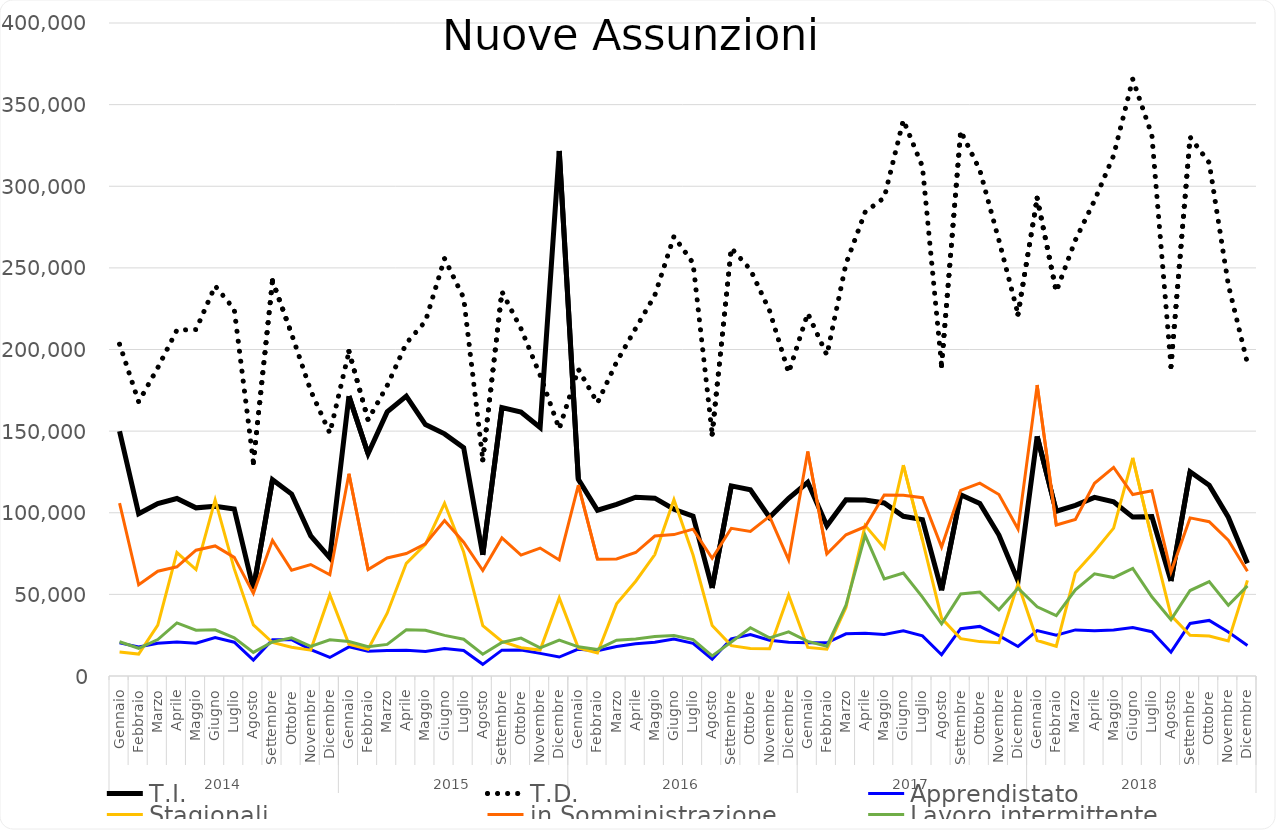
| Category | T.I. | T.D. | Apprendistato | Stagionali | in Somministrazione | Lavoro intermittente |
|---|---|---|---|---|---|---|
| 0 | 149951 | 203248 | 20280 | 14705 | 105866 | 20990 |
| 1 | 99368 | 167928 | 17721 | 13434 | 55878 | 16977 |
| 2 | 105671 | 188845 | 20009 | 31193 | 64186 | 22298 |
| 3 | 108723 | 211908 | 20876 | 75634 | 66905 | 32515 |
| 4 | 103010 | 212198 | 20048 | 65170 | 77067 | 28086 |
| 5 | 103916 | 238981 | 23514 | 107890 | 79683 | 28261 |
| 6 | 102353 | 224605 | 20682 | 65600 | 72672 | 23324 |
| 7 | 53286 | 130707 | 9744 | 31300 | 50602 | 14464 |
| 8 | 120205 | 242121 | 22153 | 20515 | 83093 | 20807 |
| 9 | 111455 | 209450 | 22258 | 17567 | 64760 | 23389 |
| 10 | 85823 | 174766 | 16131 | 15859 | 68301 | 18116 |
| 11 | 72408 | 148754 | 11359 | 49805 | 62007 | 22158 |
| 12 | 171431 | 198775 | 17845 | 19476 | 123860 | 21126 |
| 13 | 136182 | 156934 | 15143 | 16458 | 65159 | 17885 |
| 14 | 161813 | 177851 | 15680 | 38475 | 72309 | 19350 |
| 15 | 171450 | 203833 | 15717 | 69025 | 75059 | 28365 |
| 16 | 153996 | 217260 | 15046 | 80646 | 80974 | 28057 |
| 17 | 148319 | 255660 | 16906 | 105780 | 95206 | 24901 |
| 18 | 139897 | 231655 | 15602 | 75956 | 82001 | 22528 |
| 19 | 74174 | 132417 | 7145 | 30817 | 64637 | 13368 |
| 20 | 164378 | 235449 | 15842 | 21229 | 84594 | 20575 |
| 21 | 161713 | 212745 | 15916 | 17311 | 74092 | 23189 |
| 22 | 152211 | 184281 | 13860 | 15926 | 78355 | 17206 |
| 23 | 321583 | 151373 | 11617 | 47855 | 71094 | 22047 |
| 24 | 120402 | 187899 | 16458 | 17136 | 116865 | 17879 |
| 25 | 101557 | 167268 | 15428 | 14045 | 71554 | 16305 |
| 26 | 105165 | 192326 | 18087 | 44177 | 71651 | 21910 |
| 27 | 109512 | 212996 | 19707 | 58057 | 75638 | 22681 |
| 28 | 108930 | 233220 | 20626 | 74399 | 85739 | 24219 |
| 29 | 102146 | 269268 | 22714 | 108017 | 86615 | 24850 |
| 30 | 97940 | 252934 | 19966 | 74107 | 89940 | 22320 |
| 31 | 53914 | 148196 | 10292 | 30914 | 72134 | 12304 |
| 32 | 116468 | 262128 | 22783 | 18614 | 90496 | 20794 |
| 33 | 114076 | 248940 | 25339 | 16800 | 88596 | 29586 |
| 34 | 97177 | 223845 | 21895 | 16654 | 97825 | 23381 |
| 35 | 108826 | 185746 | 20687 | 49669 | 71095 | 26995 |
| 36 | 118642 | 222212 | 20341 | 17511 | 137485 | 21163 |
| 37 | 91978 | 196546 | 20371 | 16461 | 74710 | 18294 |
| 38 | 108008 | 252548 | 25848 | 41949 | 86507 | 43461 |
| 39 | 107780 | 284104 | 26239 | 92254 | 91441 | 86160 |
| 40 | 106005 | 292998 | 25488 | 78457 | 110889 | 59443 |
| 41 | 97841 | 340529 | 27637 | 129144 | 110782 | 63089 |
| 42 | 95813 | 312005 | 24585 | 83240 | 109211 | 48356 |
| 43 | 52459 | 190176 | 13030 | 35425 | 79003 | 31896 |
| 44 | 110981 | 333856 | 28987 | 22898 | 113760 | 50264 |
| 45 | 105622 | 309928 | 30377 | 21062 | 118117 | 51385 |
| 46 | 86352 | 266854 | 24733 | 20364 | 111174 | 40539 |
| 47 | 58194 | 221675 | 18065 | 56502 | 90015 | 53815 |
| 48 | 146796 | 292676 | 27840 | 21747 | 178208 | 42361 |
| 49 | 100918 | 235526 | 25000 | 18227 | 92479 | 36953 |
| 50 | 104520 | 267022 | 28227 | 63254 | 95900 | 52770 |
| 51 | 109444 | 291280 | 27675 | 76299 | 118080 | 62601 |
| 52 | 106744 | 318855 | 28230 | 90559 | 127781 | 60286 |
| 53 | 97337 | 365562 | 29694 | 133671 | 111146 | 65860 |
| 54 | 97611 | 331382 | 27156 | 84166 | 113488 | 48538 |
| 55 | 58190 | 189553 | 14610 | 37129 | 63701 | 34528 |
| 56 | 125115 | 330129 | 32220 | 24999 | 96860 | 52356 |
| 57 | 116919 | 314405 | 34053 | 24435 | 94527 | 57810 |
| 58 | 97261 | 239622 | 26906 | 21460 | 83232 | 43351 |
| 59 | 69095 | 191477 | 18628 | 58552 | 64124 | 55177 |